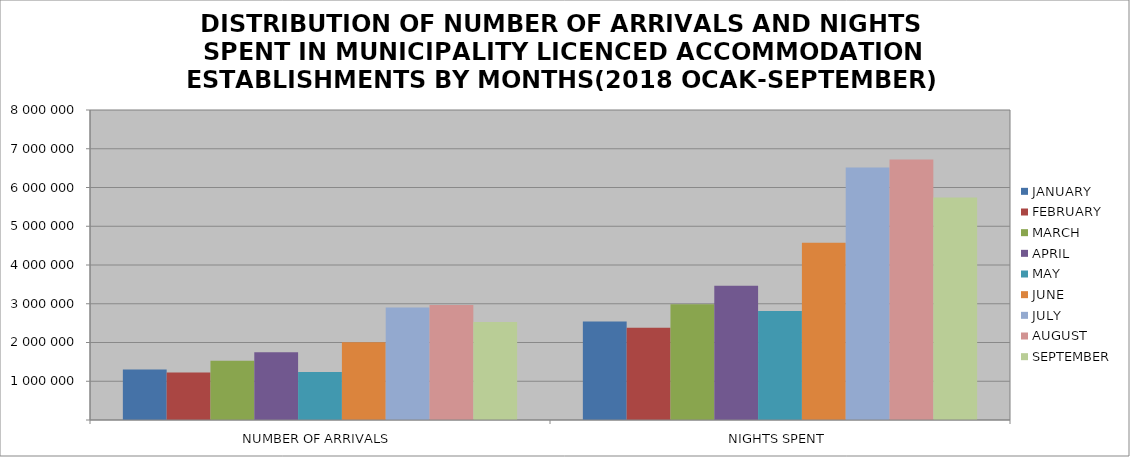
| Category | JANUARY | FEBRUARY | MARCH | APRIL | MAY | JUNE | JULY | AUGUST | SEPTEMBER |
|---|---|---|---|---|---|---|---|---|---|
| NUMBER OF ARRIVALS | 1303353 | 1223475 | 1526172 | 1749085 | 1240889 | 2003881 | 2904028 | 2966995 | 2525986 |
| NIGHTS SPENT | 2542103 | 2381300 | 2986820 | 3463261 | 2810808 | 4572629 | 6517690 | 6721558 | 5740112 |